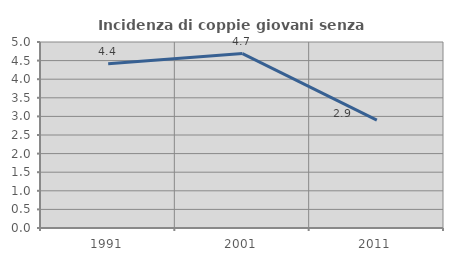
| Category | Incidenza di coppie giovani senza figli |
|---|---|
| 1991.0 | 4.417 |
| 2001.0 | 4.689 |
| 2011.0 | 2.902 |